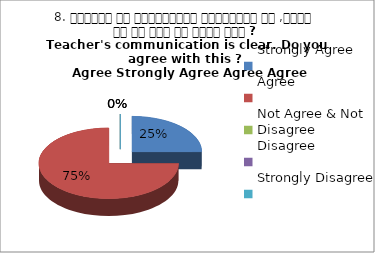
| Category | 8. शिक्षक का सम्प्रेषण सुस्पष्ठ है ,क्या आप इस बात से सहमत हैं ?
Teacher's communication is clear. Do you agree with this ? 
 Agree Strongly Agree Agree Agree |
|---|---|
| Strongly Agree | 1 |
| Agree | 3 |
| Not Agree & Not Disagree | 0 |
| Disagree | 0 |
| Strongly Disagree | 0 |